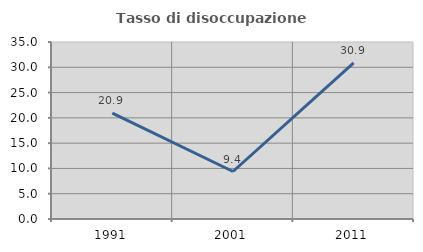
| Category | Tasso di disoccupazione giovanile  |
|---|---|
| 1991.0 | 20.939 |
| 2001.0 | 9.391 |
| 2011.0 | 30.875 |